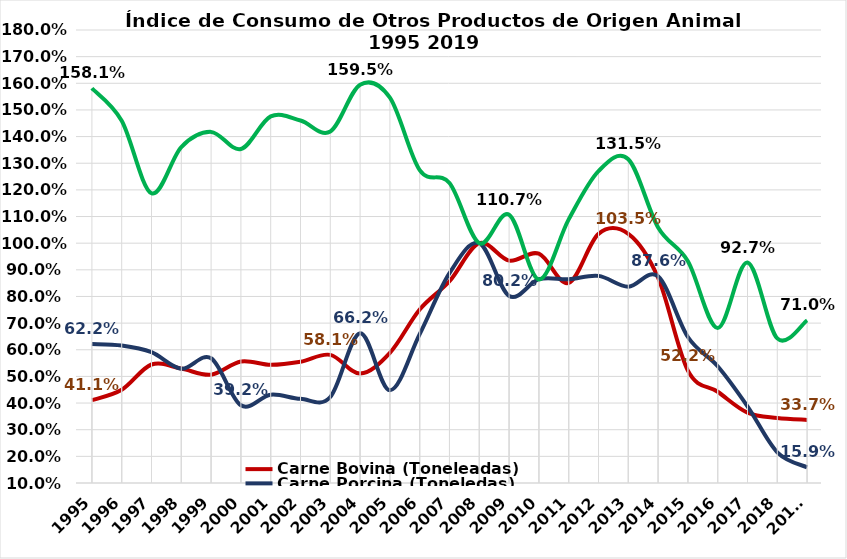
| Category | Carne Bovina (Toneleadas) | Carne Porcina (Toneledas) | Pesca Artesanal y Acuicultura (Toneladas) |
|---|---|---|---|
| 1995 | 0.411 | 0.622 | 1.581 |
| 1996 | 0.45 | 0.616 | 1.46 |
| 1997 | 0.545 | 0.591 | 1.187 |
| 1998 | 0.529 | 0.529 | 1.361 |
| 1999 | 0.506 | 0.568 | 1.418 |
| 2000 | 0.556 | 0.392 | 1.353 |
| 2001 | 0.544 | 0.431 | 1.476 |
| 2002 | 0.555 | 0.416 | 1.46 |
| 2003 | 0.581 | 0.423 | 1.419 |
| 2004 | 0.511 | 0.662 | 1.595 |
| 2005 | 0.588 | 0.448 | 1.546 |
| 2006 | 0.751 | 0.659 | 1.274 |
| 2007 | 0.857 | 0.888 | 1.226 |
| 2008 | 1 | 1 | 1 |
| 2009 | 0.935 | 0.802 | 1.107 |
| 2010 | 0.96 | 0.865 | 0.864 |
| 2011 | 0.851 | 0.865 | 1.089 |
| 2012 | 1.035 | 0.877 | 1.271 |
| 2013 | 1.035 | 0.837 | 1.315 |
| 2014 | 0.87 | 0.876 | 1.059 |
| 2015 | 0.522 | 0.648 | 0.932 |
| 2016 | 0.442 | 0.538 | 0.682 |
| 2017 | 0.364 | 0.388 | 0.927 |
| 2018 | 0.344 | 0.215 | 0.643 |
| 2019* | 0.337 | 0.159 | 0.71 |